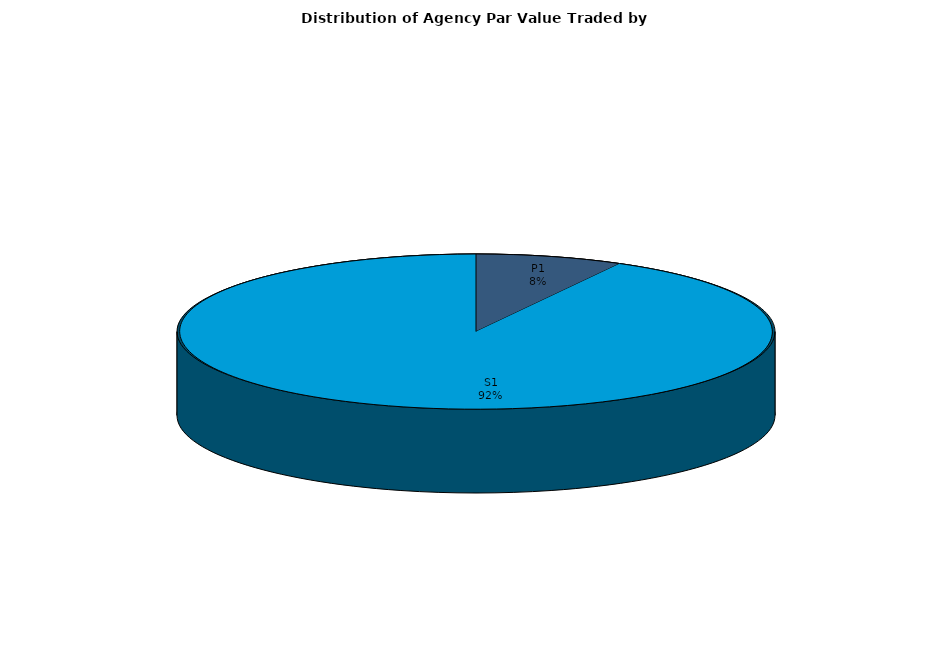
| Category | Series 0 |
|---|---|
| P1 | 525266762.103 |
| S1 | 6046269518.109 |